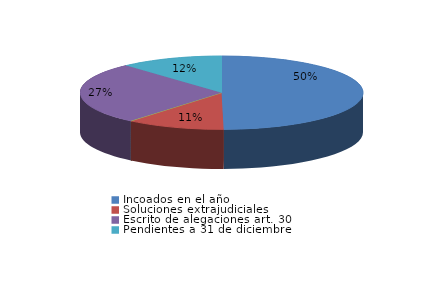
| Category | Series 0 |
|---|---|
| Incoados en el año | 313 |
| Soluciones extrajudiciales | 71 |
| Sobreseimiento del art. 27.4 | 0 |
| Escrito de alegaciones art. 30 | 171 |
| Pendientes a 31 de diciembre | 74 |